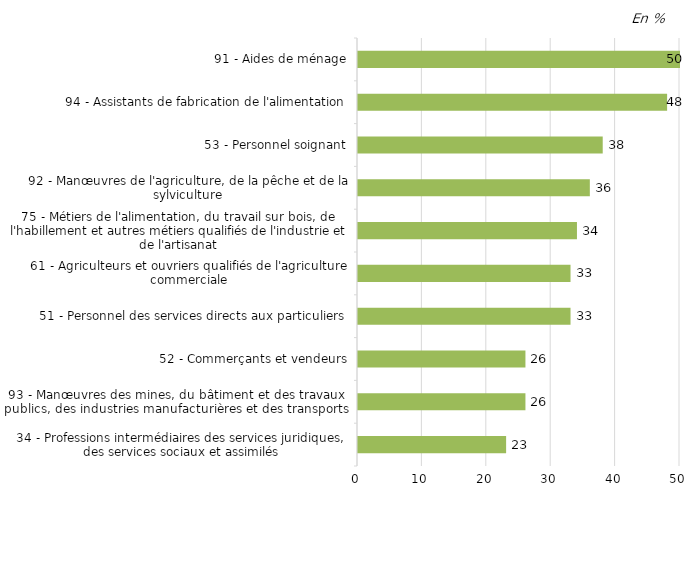
| Category | Travailleurs à bas revenus (en %) |
|---|---|
| 34 - Professions intermédiaires des services juridiques, des services sociaux et assimilés | 23 |
| 93 - Manœuvres des mines, du bâtiment et des travaux publics, des industries manufacturières et des transports | 26 |
| 52 - Commerçants et vendeurs | 26 |
| 51 - Personnel des services directs aux particuliers | 33 |
| 61 - Agriculteurs et ouvriers qualifiés de l'agriculture commerciale | 33 |
| 75 - Métiers de l'alimentation, du travail sur bois, de l'habillement et autres métiers qualifiés de l'industrie et de l'artisanat | 34 |
| 92 - Manœuvres de l'agriculture, de la pêche et de la sylviculture | 36 |
| 53 - Personnel soignant | 38 |
| 94 - Assistants de fabrication de l'alimentation | 48 |
| 91 - Aides de ménage | 50 |